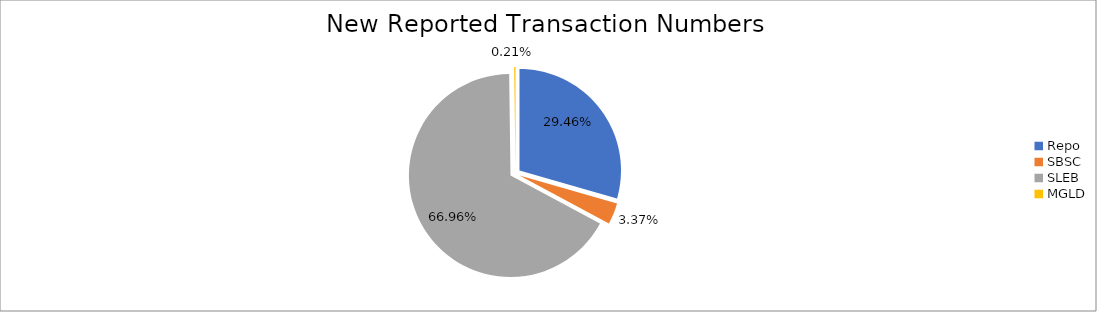
| Category | Series 0 |
|---|---|
| Repo | 387494 |
| SBSC | 44375 |
| SLEB | 880723 |
| MGLD | 2716 |